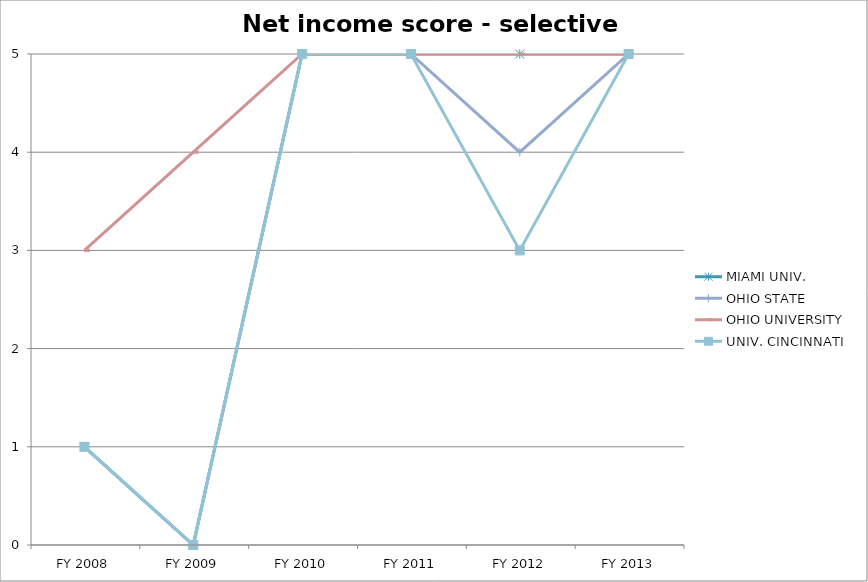
| Category | MIAMI UNIV.  | OHIO STATE  | OHIO UNIVERSITY  | UNIV. CINCINNATI  |
|---|---|---|---|---|
| FY 2013 | 5 | 5 | 5 | 5 |
| FY 2012 | 5 | 4 | 5 | 3 |
| FY 2011 | 5 | 5 | 5 | 5 |
| FY 2010 | 5 | 5 | 5 | 5 |
| FY 2009 | 0 | 0 | 4 | 0 |
| FY 2008 | 1 | 1 | 3 | 1 |